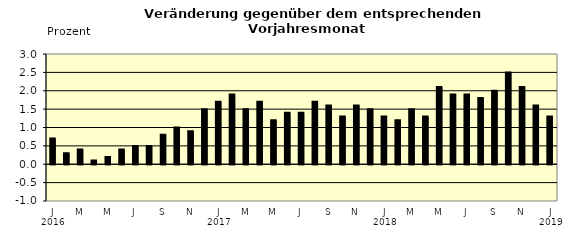
| Category | Series 0 |
|---|---|
| 0 | 0.7 |
| 1 | 0.3 |
| 2 | 0.4 |
| 3 | 0.1 |
| 4 | 0.2 |
| 5 | 0.4 |
| 6 | 0.5 |
| 7 | 0.5 |
| 8 | 0.8 |
| 9 | 1 |
| 10 | 0.9 |
| 11 | 1.5 |
| 12 | 1.7 |
| 13 | 1.9 |
| 14 | 1.5 |
| 15 | 1.7 |
| 16 | 1.2 |
| 17 | 1.4 |
| 18 | 1.4 |
| 19 | 1.7 |
| 20 | 1.6 |
| 21 | 1.3 |
| 22 | 1.6 |
| 23 | 1.5 |
| 24 | 1.3 |
| 25 | 1.2 |
| 26 | 1.5 |
| 27 | 1.3 |
| 28 | 2.1 |
| 29 | 1.9 |
| 30 | 1.9 |
| 31 | 1.8 |
| 32 | 2 |
| 33 | 2.5 |
| 34 | 2.1 |
| 35 | 1.6 |
| 36 | 1.3 |